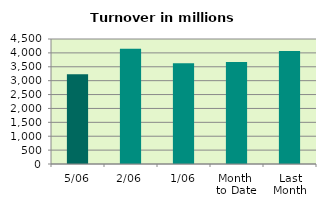
| Category | Series 0 |
|---|---|
| 5/06 | 3232.824 |
| 2/06 | 4152.562 |
| 1/06 | 3623.828 |
| Month 
to Date | 3669.738 |
| Last
Month | 4067.502 |